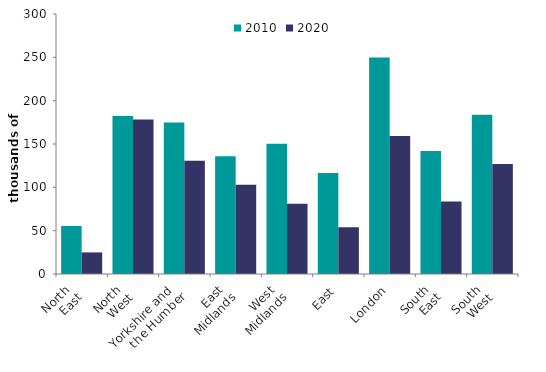
| Category | 2010 | 2020 |
|---|---|---|
| North 
East | 55.526 | 24.907 |
| North 
West | 182.235 | 178.364 |
| Yorkshire and 
the Humber | 174.907 | 130.583 |
| East 
Midlands | 136.005 | 103.099 |
| West 
Midlands | 150.321 | 81 |
| East | 116.406 | 53.84 |
| London | 249.873 | 159.188 |
| South 
East | 141.807 | 83.51 |
| South 
West | 183.704 | 126.951 |